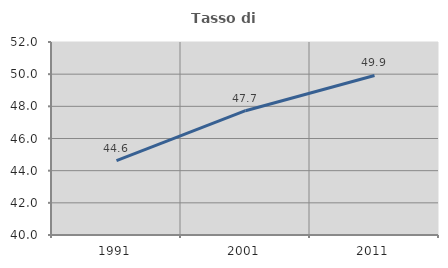
| Category | Tasso di occupazione   |
|---|---|
| 1991.0 | 44.622 |
| 2001.0 | 47.728 |
| 2011.0 | 49.921 |